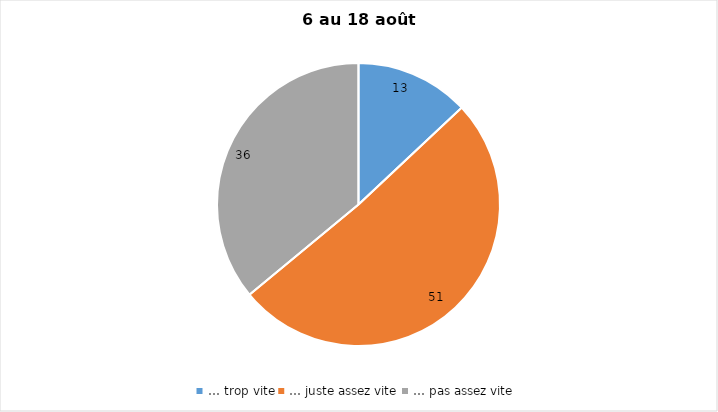
| Category | Series 0 |
|---|---|
| … trop vite | 13 |
| … juste assez vite | 51 |
| … pas assez vite | 36 |